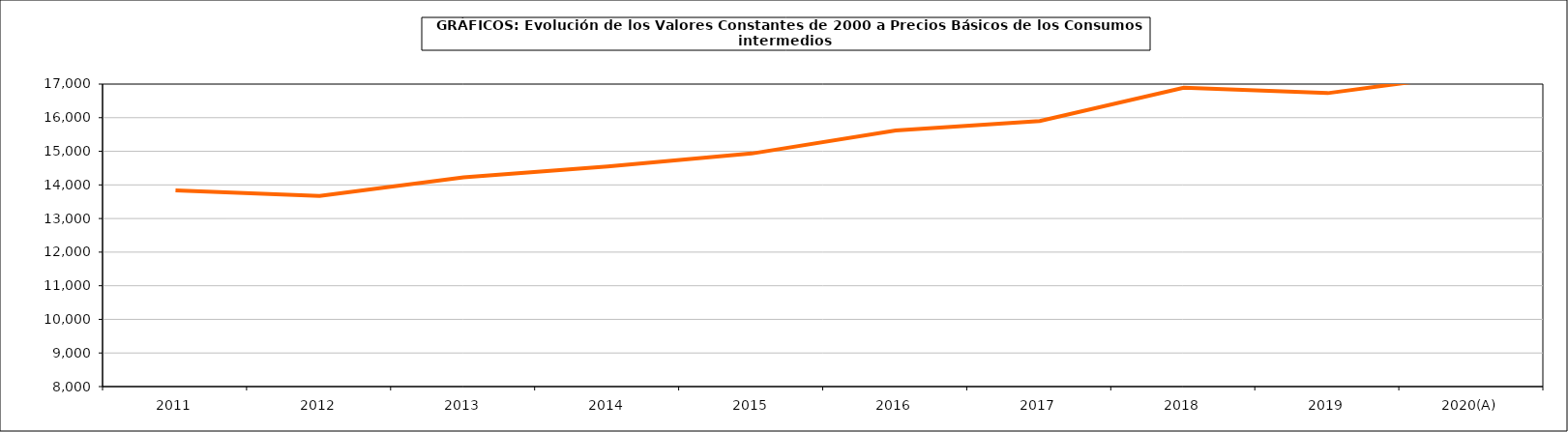
| Category | Total consumos intermedios |
|---|---|
| 2011 | 13835.8 |
| 2012 | 13669.3 |
| 2013 | 14227.7 |
| 2014 | 14550.6 |
| 2015 | 14933.8 |
| 2016 | 15620.2 |
| 2017 | 15898.5 |
| 2018 | 16891.1 |
| 2019 | 16730.8 |
| 2020(A) | 17296.3 |